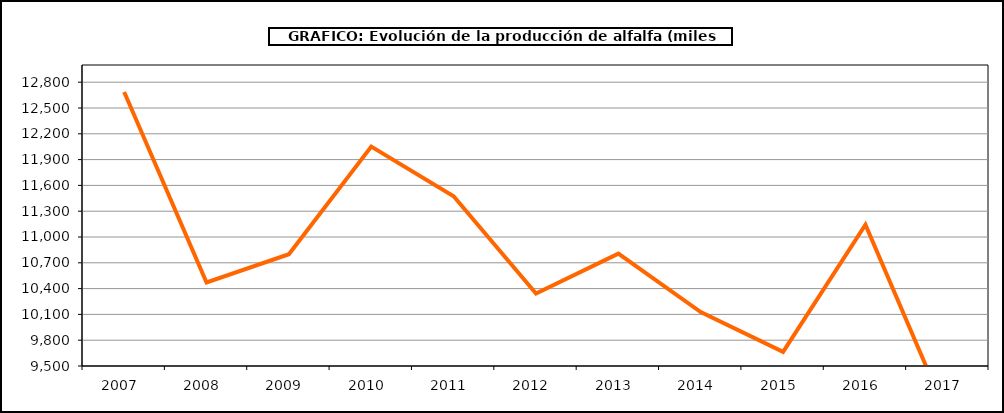
| Category | Producción |
|---|---|
| 2007.0 | 12685.642 |
| 2008.0 | 10471.156 |
| 2009.0 | 10799.35 |
| 2010.0 | 12051.422 |
| 2011.0 | 11474.193 |
| 2012.0 | 10342.799 |
| 2013.0 | 10806.54 |
| 2014.0 | 10126.971 |
| 2015.0 | 9664.728 |
| 2016.0 | 11143.962 |
| 2017.0 | 8908.163 |